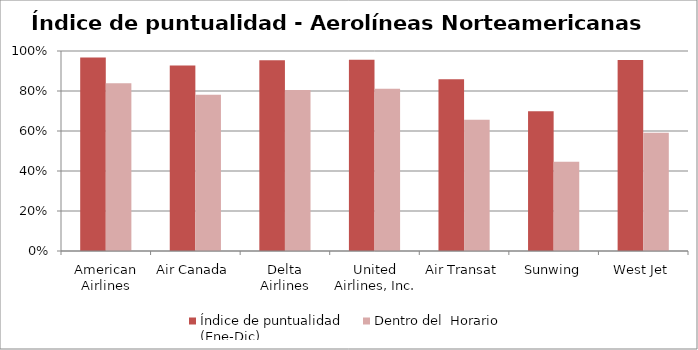
| Category | Índice de puntualidad
(Ene-Dic) | Dentro del  Horario |
|---|---|---|
| American Airlines | 0.967 | 0.838 |
| Air Canada | 0.927 | 0.782 |
| Delta Airlines | 0.954 | 0.805 |
| United Airlines, Inc. | 0.956 | 0.811 |
| Air Transat | 0.859 | 0.656 |
| Sunwing | 0.699 | 0.447 |
| West Jet | 0.955 | 0.591 |